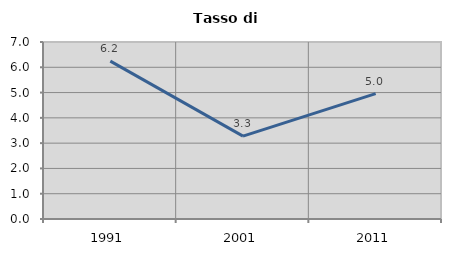
| Category | Tasso di disoccupazione   |
|---|---|
| 1991.0 | 6.244 |
| 2001.0 | 3.277 |
| 2011.0 | 4.957 |